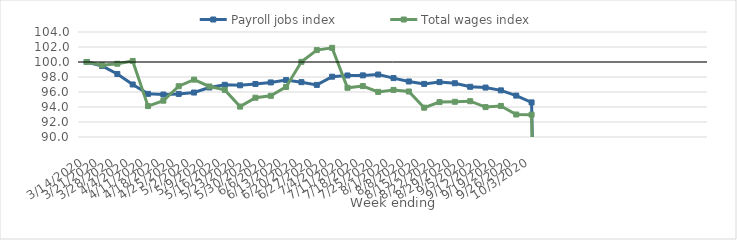
| Category | Payroll jobs index | Total wages index |
|---|---|---|
| 14/03/2020 | 100 | 100 |
| 21/03/2020 | 99.47 | 99.563 |
| 28/03/2020 | 98.402 | 99.768 |
| 04/04/2020 | 97 | 100.13 |
| 11/04/2020 | 95.753 | 94.119 |
| 18/04/2020 | 95.662 | 94.84 |
| 25/04/2020 | 95.747 | 96.773 |
| 02/05/2020 | 95.929 | 97.65 |
| 09/05/2020 | 96.598 | 96.734 |
| 16/05/2020 | 96.962 | 96.285 |
| 23/05/2020 | 96.893 | 94.055 |
| 30/05/2020 | 97.072 | 95.238 |
| 06/06/2020 | 97.276 | 95.491 |
| 13/06/2020 | 97.588 | 96.677 |
| 20/06/2020 | 97.312 | 100.023 |
| 27/06/2020 | 96.948 | 101.587 |
| 04/07/2020 | 98.04 | 101.888 |
| 11/07/2020 | 98.204 | 96.564 |
| 18/07/2020 | 98.217 | 96.787 |
| 25/07/2020 | 98.327 | 96.016 |
| 01/08/2020 | 97.855 | 96.279 |
| 08/08/2020 | 97.403 | 96.065 |
| 15/08/2020 | 97.08 | 93.909 |
| 22/08/2020 | 97.32 | 94.651 |
| 29/08/2020 | 97.167 | 94.696 |
| 05/09/2020 | 96.694 | 94.774 |
| 12/09/2020 | 96.593 | 93.987 |
| 19/09/2020 | 96.218 | 94.14 |
| 26/09/2020 | 95.52 | 93.002 |
| 03/10/2020 | 94.614 | 92.983 |